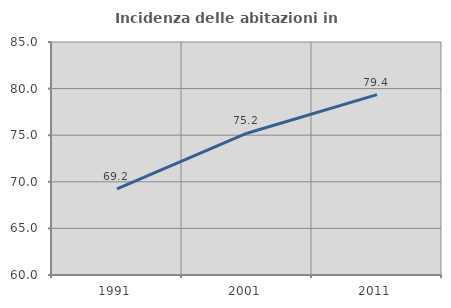
| Category | Incidenza delle abitazioni in proprietà  |
|---|---|
| 1991.0 | 69.237 |
| 2001.0 | 75.213 |
| 2011.0 | 79.359 |